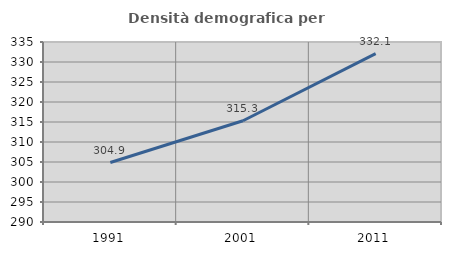
| Category | Densità demografica |
|---|---|
| 1991.0 | 304.873 |
| 2001.0 | 315.318 |
| 2011.0 | 332.074 |